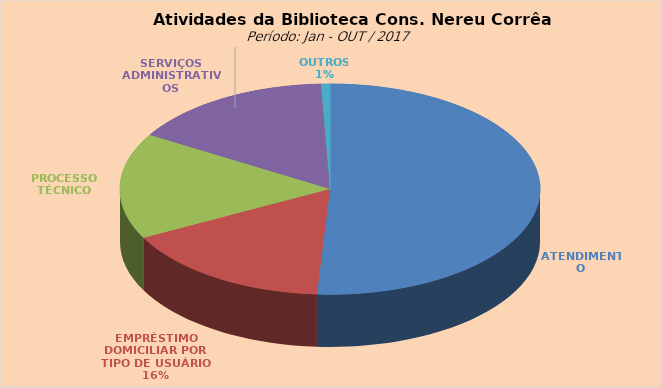
| Category | Series 0 |
|---|---|
| ATENDIMENTO | 11946 |
| EMPRÉSTIMO DOMICILIAR POR TIPO DE USUÁRIO | 3830 |
| PROCESSO TÉCNICO | 3812 |
| SERVIÇOS ADMINISTRATIVOS | 3679 |
| OUTROS | 161 |